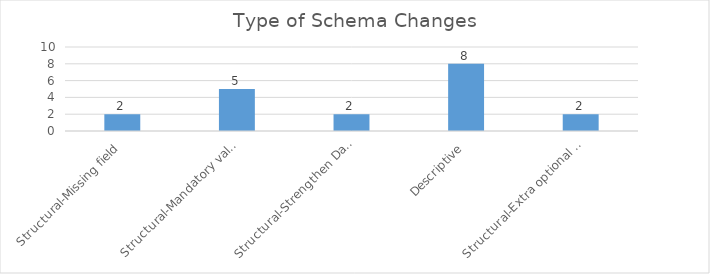
| Category | Count of Structural/Descriptive |
|---|---|
| Structural-Missing field | 2 |
| Structural-Mandatory values not reported | 5 |
| Structural-Strengthen Data Quality | 2 |
| Descriptive | 8 |
| Structural-Extra optional fields | 2 |